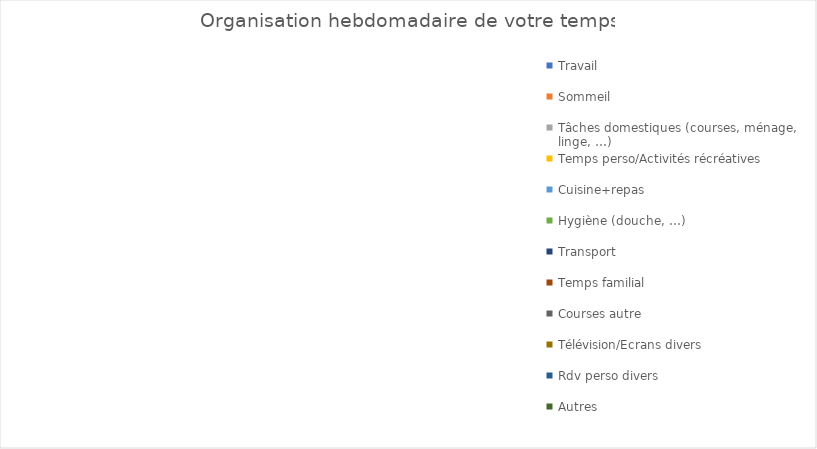
| Category | Series 0 |
|---|---|
| Travail | 0 |
| Sommeil | 0 |
| Tâches domestiques (courses, ménage, linge, …) | 0 |
| Temps perso/Activités récréatives | 0 |
| Cuisine+repas | 0 |
| Hygiène (douche, …) | 0 |
| Transport | 0 |
| Temps familial | 0 |
| Courses autre | 0 |
| Télévision/Ecrans divers | 0 |
| Rdv perso divers | 0 |
| Autres | 0 |